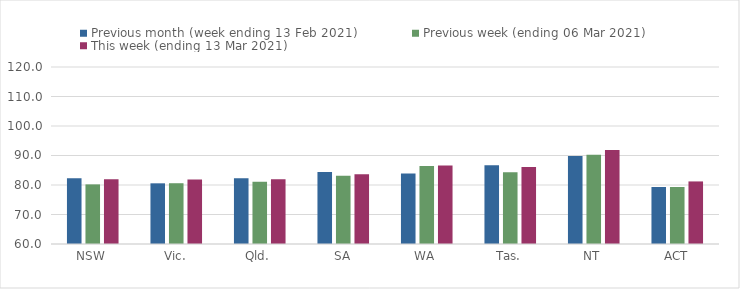
| Category | Previous month (week ending 13 Feb 2021) | Previous week (ending 06 Mar 2021) | This week (ending 13 Mar 2021) |
|---|---|---|---|
| NSW | 82.32 | 80.21 | 81.94 |
| Vic. | 80.57 | 80.6 | 81.9 |
| Qld. | 82.3 | 81.1 | 81.99 |
| SA | 84.44 | 83.15 | 83.64 |
| WA | 83.88 | 86.42 | 86.58 |
| Tas. | 86.73 | 84.36 | 86.1 |
| NT | 89.84 | 90.26 | 91.88 |
| ACT | 79.32 | 79.32 | 81.21 |